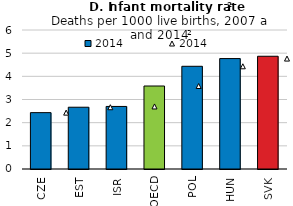
| Category | 2014 |
|---|---|
| CZE | 2.433 |
| EST | 2.667 |
| ISR | 2.7 |
| OECD | 3.582 |
| POL | 4.433 |
| HUN | 4.767 |
| SVK | 4.867 |